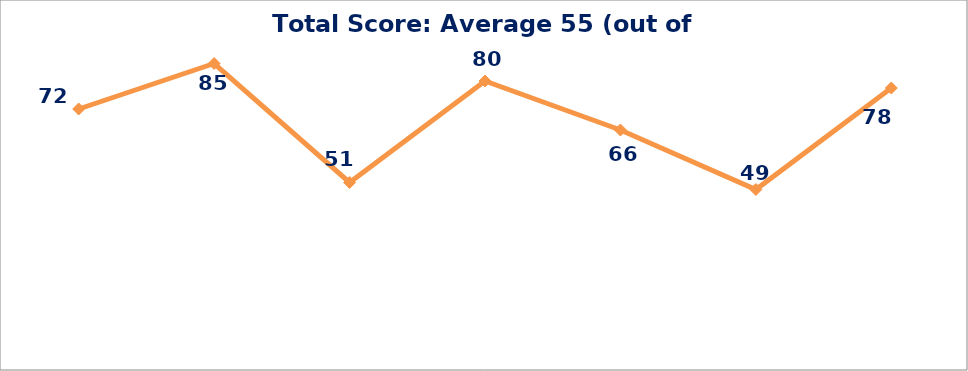
| Category | TOTAL SCORE |
|---|---|
| 0 | 72 |
| 1 | 85 |
| 2 | 51 |
| 3 | 80 |
| 4 | 66 |
| 5 | 49 |
| 6 | 78 |